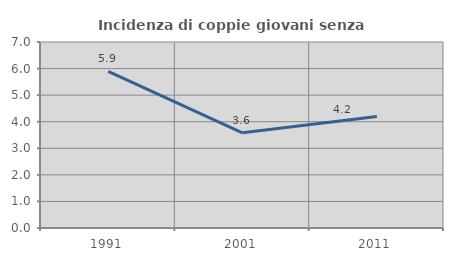
| Category | Incidenza di coppie giovani senza figli |
|---|---|
| 1991.0 | 5.894 |
| 2001.0 | 3.584 |
| 2011.0 | 4.2 |